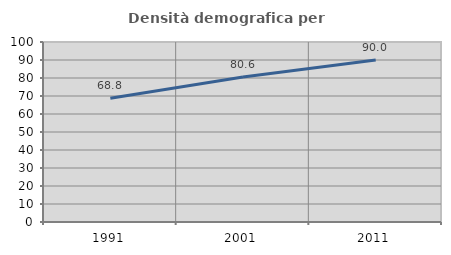
| Category | Densità demografica |
|---|---|
| 1991.0 | 68.765 |
| 2001.0 | 80.609 |
| 2011.0 | 90.019 |